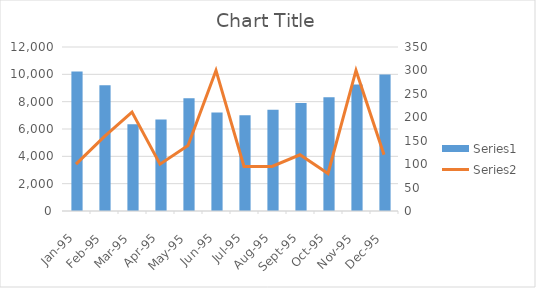
| Category | Series 0 |
|---|---|
| 1995-01-01 | 10200 |
| 1995-02-01 | 9200 |
| 1995-03-01 | 6350 |
| 1995-04-01 | 6700 |
| 1995-05-01 | 8250 |
| 1995-06-01 | 7200 |
| 1995-07-01 | 7000 |
| 1995-08-01 | 7400 |
| 1995-09-01 | 7900 |
| 1995-10-01 | 8325 |
| 1995-11-01 | 9260 |
| 1995-12-01 | 9990 |